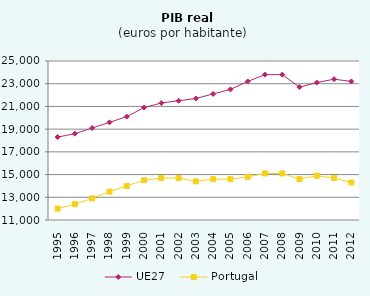
| Category | UE27 | Portugal |
|---|---|---|
| 1995.0 | 18300 | 12000 |
| 1996.0 | 18600 | 12400 |
| 1997.0 | 19100 | 12900 |
| 1998.0 | 19600 | 13500 |
| 1999.0 | 20100 | 14000 |
| 2000.0 | 20900 | 14500 |
| 2001.0 | 21300 | 14700 |
| 2002.0 | 21500 | 14700 |
| 2003.0 | 21700 | 14400 |
| 2004.0 | 22100 | 14600 |
| 2005.0 | 22500 | 14600 |
| 2006.0 | 23200 | 14800 |
| 2007.0 | 23800 | 15100 |
| 2008.0 | 23800 | 15100 |
| 2009.0 | 22700 | 14600 |
| 2010.0 | 23100 | 14900 |
| 2011.0 | 23400 | 14700 |
| 2012.0 | 23200 | 14300 |